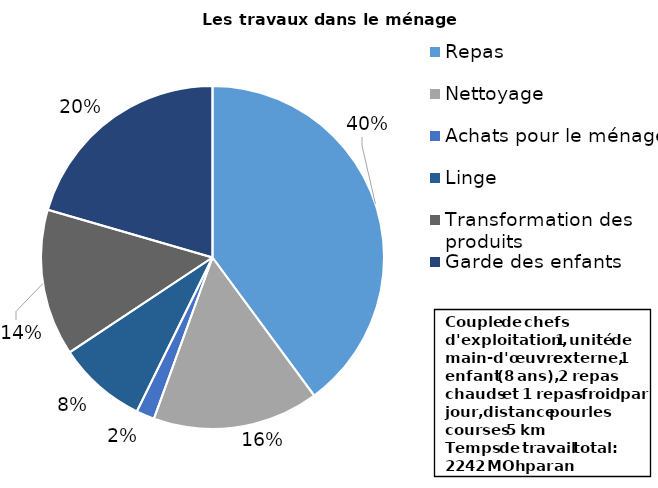
| Category | Series 0 |
|---|---|
| Repas | 894.4 |
| Nettoyage | 351 |
| Achats pour le ménage | 38.6 |
| Linge | 188.3 |
| Transformation des produits | 310 |
| Garde des enfants | 459.7 |